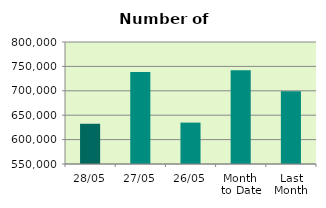
| Category | Series 0 |
|---|---|
| 28/05 | 632456 |
| 27/05 | 738326 |
| 26/05 | 634850 |
| Month 
to Date | 741871.4 |
| Last
Month | 699227 |